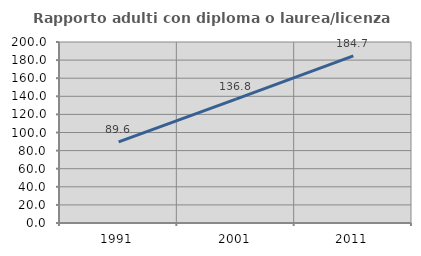
| Category | Rapporto adulti con diploma o laurea/licenza media  |
|---|---|
| 1991.0 | 89.587 |
| 2001.0 | 136.785 |
| 2011.0 | 184.739 |